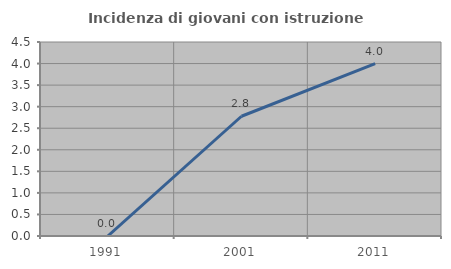
| Category | Incidenza di giovani con istruzione universitaria |
|---|---|
| 1991.0 | 0 |
| 2001.0 | 2.778 |
| 2011.0 | 4 |